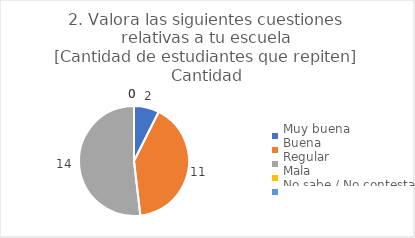
| Category | 2. Valora las siguientes cuestiones relativas a tu escuela
[Cantidad de estudiantes que repiten] |
|---|---|
| Muy buena  | 0.074 |
| Buena  | 0.407 |
| Regular  | 0.519 |
| Mala  | 0 |
| No sabe / No contesta | 0 |